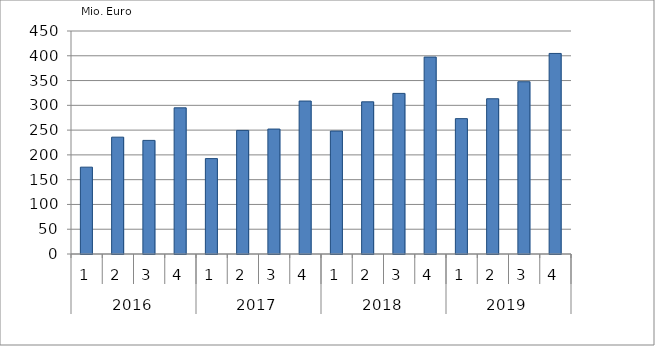
| Category | Ausbaugewerblicher Umsatz3 |
|---|---|
| 0 | 175225.59 |
| 1 | 235781.631 |
| 2 | 229227.559 |
| 3 | 294992.157 |
| 4 | 192499.539 |
| 5 | 249394.388 |
| 6 | 252146.755 |
| 7 | 308653.153 |
| 8 | 248133.418 |
| 9 | 307099.899 |
| 10 | 324088.989 |
| 11 | 397377.201 |
| 12 | 273159.137 |
| 13 | 313254.251 |
| 14 | 347631.281 |
| 15 | 404721.054 |